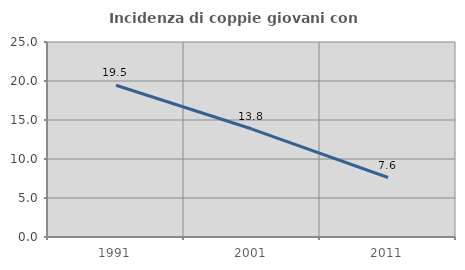
| Category | Incidenza di coppie giovani con figli |
|---|---|
| 1991.0 | 19.45 |
| 2001.0 | 13.84 |
| 2011.0 | 7.625 |